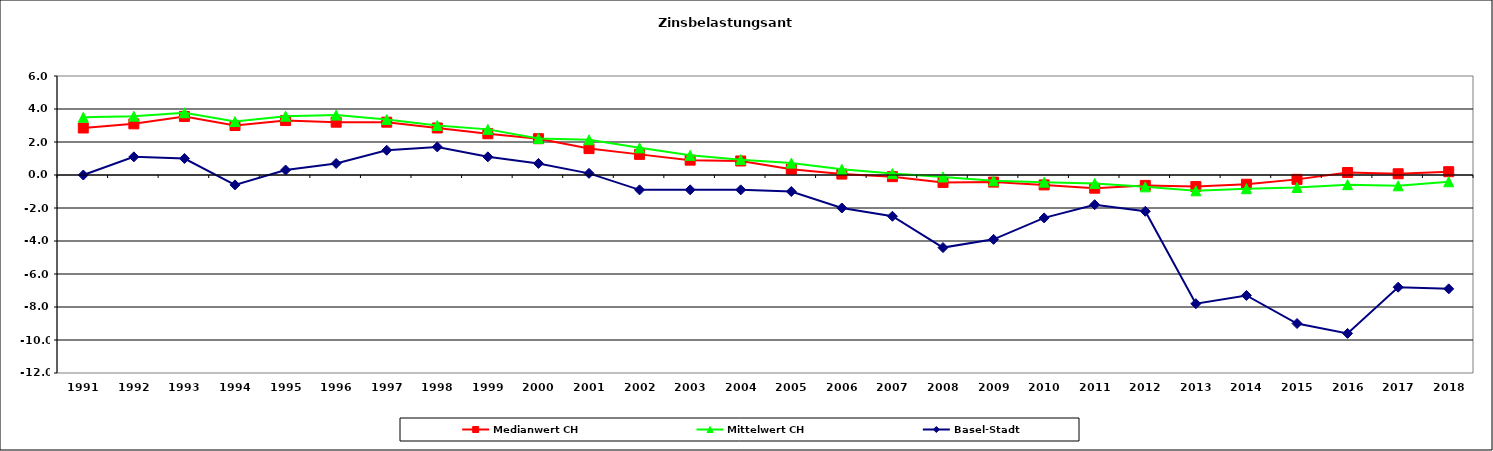
| Category | Medianwert CH | Mittelwert CH | Basel-Stadt |
|---|---|---|---|
| 1991.0 | 2.85 | 3.5 | 0 |
| 1992.0 | 3.1 | 3.565 | 1.1 |
| 1993.0 | 3.55 | 3.772 | 1 |
| 1994.0 | 3 | 3.238 | -0.6 |
| 1995.0 | 3.3 | 3.565 | 0.3 |
| 1996.0 | 3.2 | 3.632 | 0.7 |
| 1997.0 | 3.2 | 3.361 | 1.5 |
| 1998.0 | 2.85 | 3 | 1.7 |
| 1999.0 | 2.5 | 2.765 | 1.1 |
| 2000.0 | 2.2 | 2.216 | 0.7 |
| 2001.0 | 1.6 | 2.135 | 0.1 |
| 2002.0 | 1.25 | 1.646 | -0.9 |
| 2003.0 | 0.9 | 1.191 | -0.9 |
| 2004.0 | 0.85 | 0.93 | -0.9 |
| 2005.0 | 0.355 | 0.72 | -1 |
| 2006.0 | 0.055 | 0.346 | -2 |
| 2007.0 | -0.1 | 0.087 | -2.5 |
| 2008.0 | -0.45 | -0.117 | -4.4 |
| 2009.0 | -0.43 | -0.354 | -3.9 |
| 2010.0 | -0.6 | -0.433 | -2.6 |
| 2011.0 | -0.8 | -0.508 | -1.8 |
| 2012.0 | -0.63 | -0.718 | -2.2 |
| 2013.0 | -0.7 | -0.96 | -7.8 |
| 2014.0 | -0.56 | -0.829 | -7.3 |
| 2015.0 | -0.265 | -0.755 | -9 |
| 2016.0 | 0.15 | -0.587 | -9.6 |
| 2017.0 | 0.075 | -0.656 | -6.8 |
| 2018.0 | 0.2 | -0.408 | -6.9 |